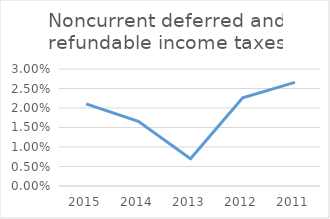
| Category | Noncurrent deferred and refundable income taxes |
|---|---|
| 2015.0 | 0.021 |
| 2014.0 | 0.017 |
| 2013.0 | 0.007 |
| 2012.0 | 0.023 |
| 2011.0 | 0.027 |